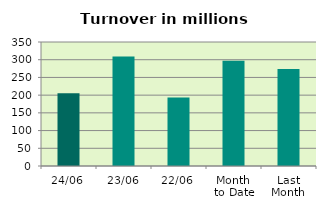
| Category | Series 0 |
|---|---|
| 24/06 | 205.127 |
| 23/06 | 308.985 |
| 22/06 | 193.277 |
| Month 
to Date | 297.145 |
| Last
Month | 273.813 |